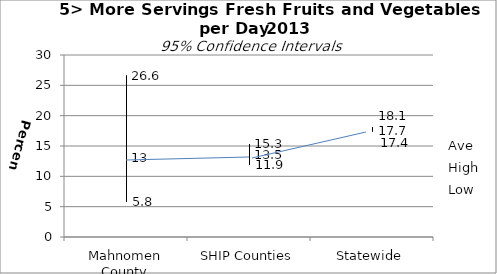
| Category | Ave | High | Low |
|---|---|---|---|
| Mahnomen County | 13 | 26.6 | 5.8 |
| SHIP Counties | 13.5 | 15.3 | 11.9 |
| Statewide | 17.7 | 18.1 | 17.4 |